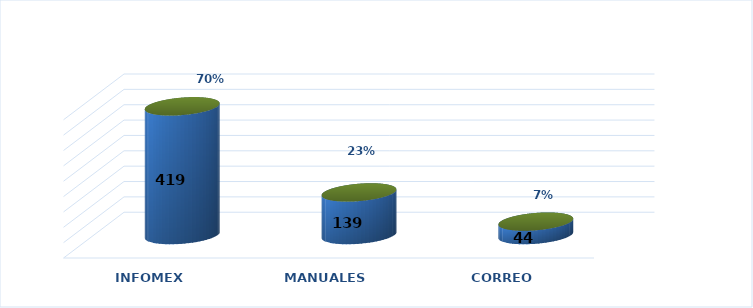
| Category | Series 0 | Series 1 |
|---|---|---|
| INFOMEX | 419 | 0.696 |
| MANUALES | 139 | 0.231 |
| CORREO | 44 | 0.073 |